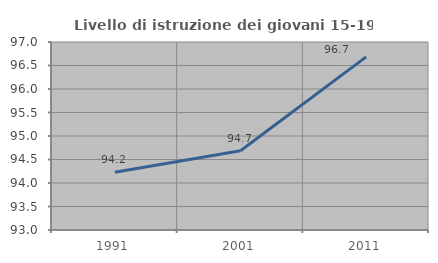
| Category | Livello di istruzione dei giovani 15-19 anni |
|---|---|
| 1991.0 | 94.231 |
| 2001.0 | 94.688 |
| 2011.0 | 96.684 |